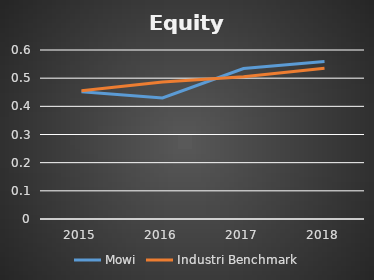
| Category | Mowi | Industri Benchmark |
|---|---|---|
| 2015.0 | 0.452 | 0.455 |
| 2016.0 | 0.43 | 0.487 |
| 2017.0 | 0.534 | 0.505 |
| 2018.0 | 0.559 | 0.535 |